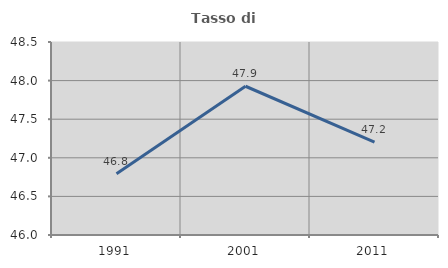
| Category | Tasso di occupazione   |
|---|---|
| 1991.0 | 46.792 |
| 2001.0 | 47.927 |
| 2011.0 | 47.202 |